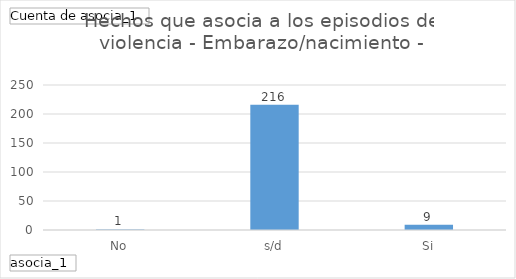
| Category | Total |
|---|---|
| No | 1 |
| s/d | 216 |
| Si | 9 |